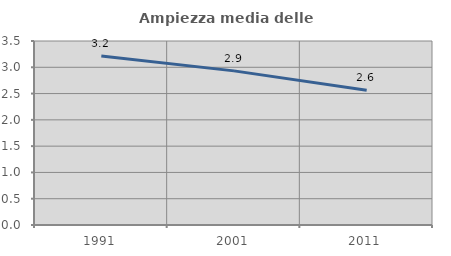
| Category | Ampiezza media delle famiglie |
|---|---|
| 1991.0 | 3.213 |
| 2001.0 | 2.932 |
| 2011.0 | 2.563 |